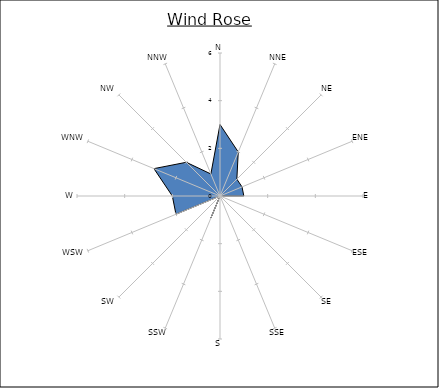
| Category | Series 0 |
|---|---|
| N | 3 |
| NNE | 2 |
| NE | 1 |
| ENE | 1 |
| E | 1 |
| ESE | 0 |
| SE | 6 |
| SSE | 0 |
| S | 0 |
| SSW | 1 |
| SW | 0 |
| WSW | 2 |
| W | 2 |
| WNW | 3 |
| NW | 2 |
| NNW | 1 |